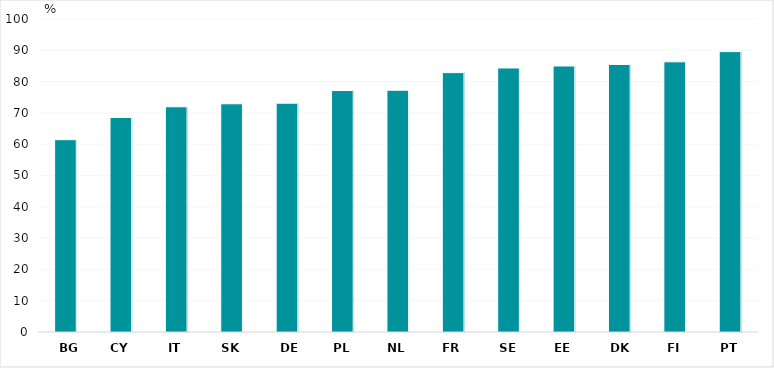
| Category | Mes parents me soutiennent dans mes efforts et réussites à l'école |
|---|---|
| BG | 61.449 |
| CY | 68.539 |
| IT | 71.952 |
| SK | 72.917 |
| DE | 73.105 |
| PL | 77.144 |
| NL | 77.246 |
| FR | 82.869 |
| SE | 84.354 |
| EE | 84.987 |
| DK | 85.472 |
| FI | 86.322 |
| PT | 89.58 |